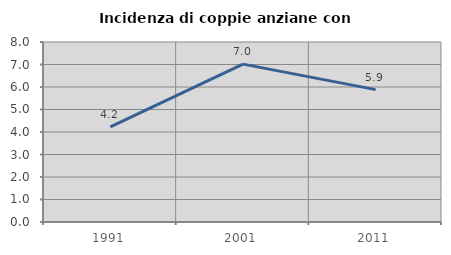
| Category | Incidenza di coppie anziane con figli |
|---|---|
| 1991.0 | 4.225 |
| 2001.0 | 7.018 |
| 2011.0 | 5.882 |